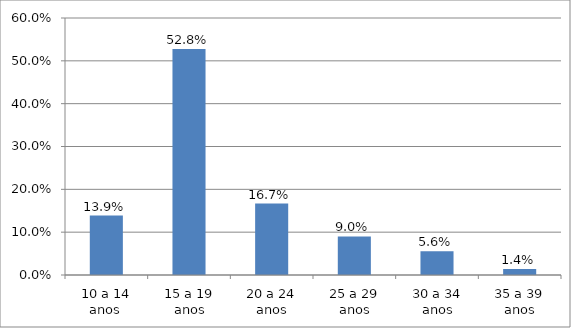
| Category | Series 0 |
|---|---|
| 10 a 14 anos  | 0.139 |
| 15 a 19 anos | 0.528 |
| 20 a 24 anos | 0.167 |
| 25 a 29 anos | 0.09 |
| 30 a 34 anos | 0.056 |
| 35 a 39 anos | 0.014 |